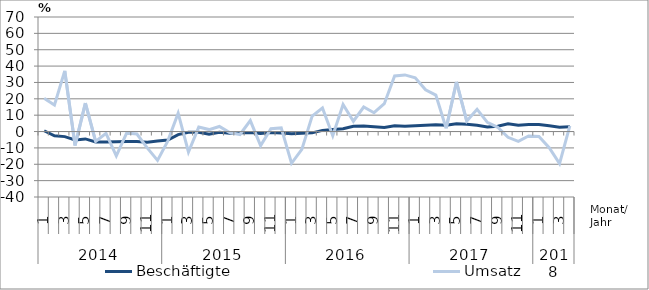
| Category | Beschäftigte | Umsatz |
|---|---|---|
| 0 | 0.5 | 20.3 |
| 1 | -2.6 | 16.2 |
| 2 | -3.1 | 37.1 |
| 3 | -5.1 | -8.5 |
| 4 | -4.5 | 17.4 |
| 5 | -6.4 | -6.1 |
| 6 | -6.4 | -1.1 |
| 7 | -6.2 | -14.9 |
| 8 | -6.1 | -0.9 |
| 9 | -6.1 | -1.5 |
| 10 | -6.6 | -10 |
| 11 | -5.8 | -17.6 |
| 12 | -5.2 | -5.7 |
| 13 | -1.9 | 11.2 |
| 14 | -0.5 | -12.5 |
| 15 | -0.5 | 2.7 |
| 16 | -1.7 | 1.2 |
| 17 | -0.5 | 3.1 |
| 18 | -1.1 | -0.6 |
| 19 | -0.8 | -1.8 |
| 20 | -0.6 | 6.7 |
| 21 | -1.2 | -8.6 |
| 22 | -0.6 | 1.7 |
| 23 | -0.9 | 2.2 |
| 24 | -1.3 | -19.4 |
| 25 | -1.1 | -10.9 |
| 26 | -0.8 | 9.4 |
| 27 | 0.7 | 14.4 |
| 28 | 1.2 | -2.6 |
| 29 | 1.7 | 16.5 |
| 30 | 3.2 | 6.3 |
| 31 | 3.4 | 15 |
| 32 | 3 | 11.5 |
| 33 | 2.5 | 17 |
| 34 | 3.6 | 34 |
| 35 | 3.2 | 34.6 |
| 36 | 3.5 | 32.8 |
| 37 | 3.8 | 25.5 |
| 38 | 4.2 | 22.3 |
| 39 | 3.9 | 2 |
| 40 | 4.7 | 30.3 |
| 41 | 4.4 | 6.4 |
| 42 | 3.9 | 13.6 |
| 43 | 2.8 | 5.6 |
| 44 | 3.3 | 2.6 |
| 45 | 4.7 | -3.5 |
| 46 | 3.8 | -6 |
| 47 | 4.3 | -2.7 |
| 48 | 4.3 | -3 |
| 49 | 3.5 | -9.9 |
| 50 | 2.7 | -19.6 |
| 51 | 3 | 3.5 |